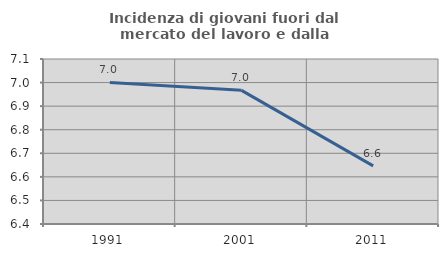
| Category | Incidenza di giovani fuori dal mercato del lavoro e dalla formazione  |
|---|---|
| 1991.0 | 7 |
| 2001.0 | 6.967 |
| 2011.0 | 6.647 |